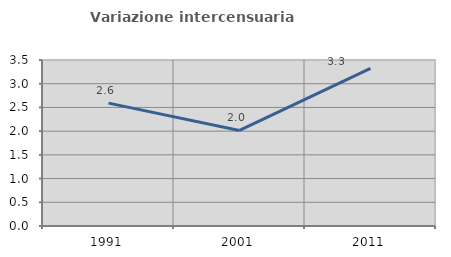
| Category | Variazione intercensuaria annua |
|---|---|
| 1991.0 | 2.59 |
| 2001.0 | 2.015 |
| 2011.0 | 3.324 |